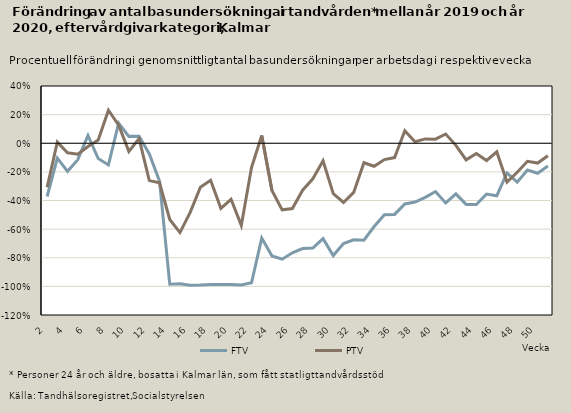
| Category | FTV | PTV |
|---|---|---|
| 2.0 | -0.372 | -0.308 |
| 3.0 | -0.104 | 0.008 |
| 4.0 | -0.196 | -0.067 |
| 5.0 | -0.115 | -0.076 |
| 6.0 | 0.054 | -0.023 |
| 7.0 | -0.107 | 0.023 |
| 8.0 | -0.151 | 0.231 |
| 9.0 | 0.14 | 0.127 |
| 10.0 | 0.048 | -0.057 |
| 11.0 | 0.049 | 0.033 |
| 12.0 | -0.074 | -0.261 |
| 13.0 | -0.265 | -0.276 |
| 14.0 | -0.984 | -0.533 |
| 15.0 | -0.982 | -0.624 |
| 16.0 | -0.991 | -0.483 |
| 17.0 | -0.99 | -0.307 |
| 18.0 | -0.986 | -0.259 |
| 19.0 | -0.987 | -0.455 |
| 20.0 | -0.988 | -0.392 |
| 21.0 | -0.991 | -0.574 |
| 22.0 | -0.975 | -0.17 |
| 23.0 | -0.663 | 0.054 |
| 24.0 | -0.788 | -0.33 |
| 25.0 | -0.81 | -0.465 |
| 26.0 | -0.766 | -0.456 |
| 27.0 | -0.735 | -0.328 |
| 28.0 | -0.733 | -0.248 |
| 29.0 | -0.667 | -0.123 |
| 30.0 | -0.785 | -0.353 |
| 31.0 | -0.701 | -0.414 |
| 32.0 | -0.675 | -0.344 |
| 33.0 | -0.677 | -0.136 |
| 34.0 | -0.582 | -0.161 |
| 35.0 | -0.499 | -0.114 |
| 36.0 | -0.497 | -0.1 |
| 37.0 | -0.424 | 0.087 |
| 38.0 | -0.411 | 0.011 |
| 39.0 | -0.378 | 0.03 |
| 40.0 | -0.337 | 0.028 |
| 41.0 | -0.417 | 0.065 |
| 42.0 | -0.354 | -0.015 |
| 43.0 | -0.427 | -0.116 |
| 44.0 | -0.429 | -0.071 |
| 45.0 | -0.355 | -0.121 |
| 46.0 | -0.367 | -0.06 |
| 47.0 | -0.207 | -0.27 |
| 48.0 | -0.272 | -0.202 |
| 49.0 | -0.187 | -0.126 |
| 50.0 | -0.21 | -0.139 |
| 51.0 | -0.16 | -0.088 |